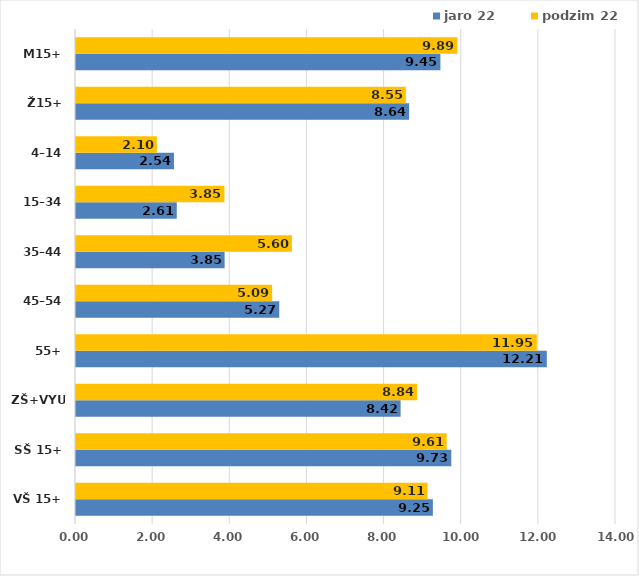
| Category | jaro 22 | podzim 22 |
|---|---|---|
| VŠ 15+ | 9.252 | 9.115 |
| SŠ 15+ | 9.73 | 9.61 |
| ZŠ+VYUČ | 8.416 | 8.844 |
| 55+ | 12.206 | 11.947 |
| 45–54 | 5.269 | 5.086 |
| 35–44 | 3.853 | 5.596 |
| 15–34 | 2.613 | 3.849 |
| 4–14 | 2.54 | 2.096 |
| Ž15+ | 8.637 | 8.55 |
| M15+ | 9.447 | 9.888 |